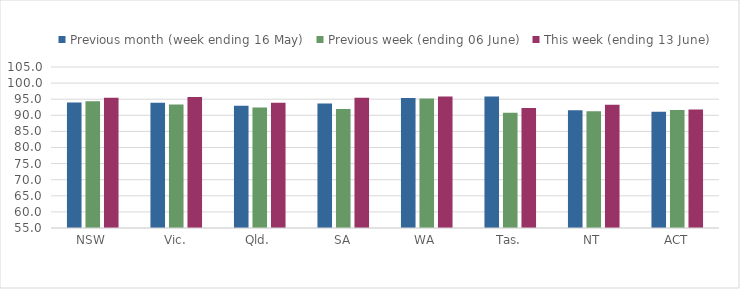
| Category | Previous month (week ending 16 May) | Previous week (ending 06 June) | This week (ending 13 June) |
|---|---|---|---|
| NSW | 93.948 | 94.375 | 95.424 |
| Vic. | 93.891 | 93.317 | 95.691 |
| Qld. | 92.967 | 92.39 | 93.899 |
| SA | 93.659 | 91.939 | 95.426 |
| WA | 95.406 | 95.238 | 95.815 |
| Tas. | 95.858 | 90.768 | 92.278 |
| NT | 91.548 | 91.263 | 93.282 |
| ACT | 91.121 | 91.676 | 91.811 |